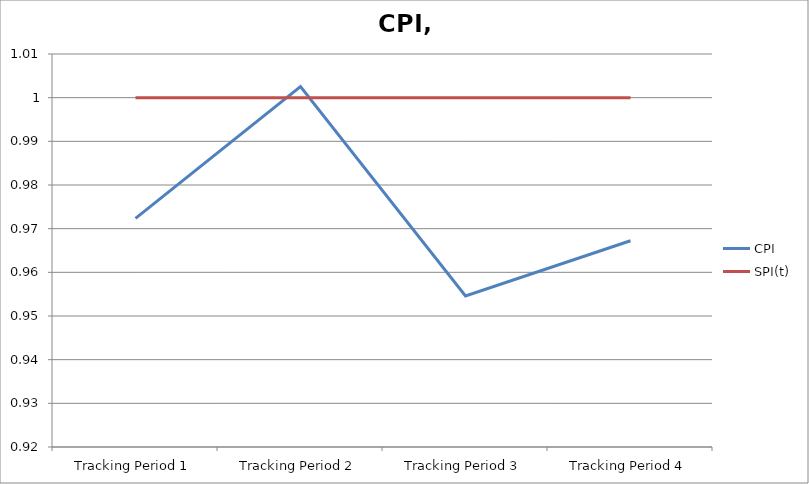
| Category | CPI | SPI(t) |
|---|---|---|
| Tracking Period 1 | 0.972 | 1 |
| Tracking Period 2 | 1.003 | 1 |
| Tracking Period 3 | 0.955 | 1 |
| Tracking Period 4 | 0.967 | 1 |